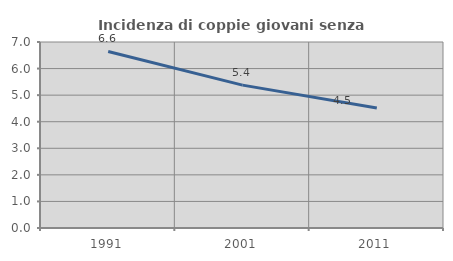
| Category | Incidenza di coppie giovani senza figli |
|---|---|
| 1991.0 | 6.644 |
| 2001.0 | 5.377 |
| 2011.0 | 4.517 |